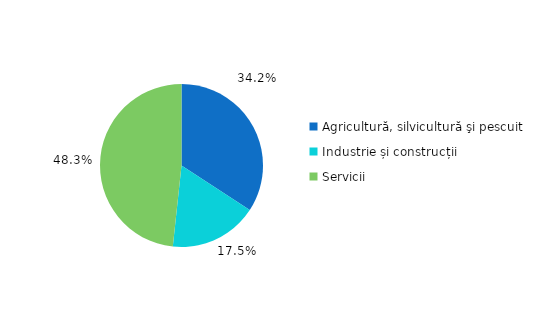
| Category | Series 0 |
|---|---|
| Agricultură, silvicultură şi pescuit | 34.2 |
| Industrie și construcții | 17.5 |
| Servicii | 48.3 |